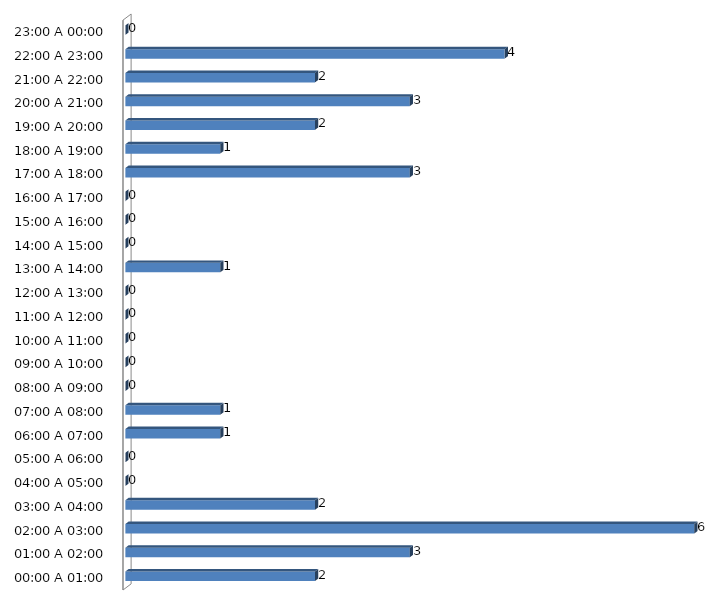
| Category | Series 0 |
|---|---|
| 00:00 A 01:00 | 2 |
| 01:00 A 02:00 | 3 |
| 02:00 A 03:00 | 6 |
| 03:00 A 04:00 | 2 |
| 04:00 A 05:00 | 0 |
| 05:00 A 06:00 | 0 |
| 06:00 A 07:00 | 1 |
| 07:00 A 08:00 | 1 |
| 08:00 A 09:00 | 0 |
| 09:00 A 10:00 | 0 |
| 10:00 A 11:00 | 0 |
| 11:00 A 12:00 | 0 |
| 12:00 A 13:00 | 0 |
| 13:00 A 14:00 | 1 |
| 14:00 A 15:00 | 0 |
| 15:00 A 16:00 | 0 |
| 16:00 A 17:00 | 0 |
| 17:00 A 18:00 | 3 |
| 18:00 A 19:00 | 1 |
| 19:00 A 20:00 | 2 |
| 20:00 A 21:00 | 3 |
| 21:00 A 22:00 | 2 |
| 22:00 A 23:00 | 4 |
| 23:00 A 00:00 | 0 |